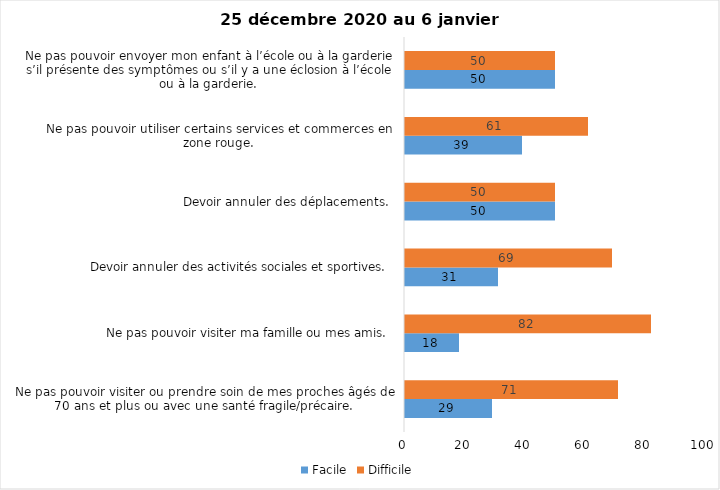
| Category | Facile | Difficile |
|---|---|---|
| Ne pas pouvoir visiter ou prendre soin de mes proches âgés de 70 ans et plus ou avec une santé fragile/précaire.  | 29 | 71 |
| Ne pas pouvoir visiter ma famille ou mes amis.  | 18 | 82 |
| Devoir annuler des activités sociales et sportives.  | 31 | 69 |
| Devoir annuler des déplacements.  | 50 | 50 |
| Ne pas pouvoir utiliser certains services et commerces en zone rouge.  | 39 | 61 |
| Ne pas pouvoir envoyer mon enfant à l’école ou à la garderie s’il présente des symptômes ou s’il y a une éclosion à l’école ou à la garderie.  | 50 | 50 |